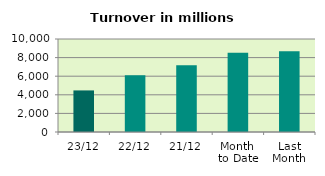
| Category | Series 0 |
|---|---|
| 23/12 | 4471.408 |
| 22/12 | 6099.31 |
| 21/12 | 7180.555 |
| Month 
to Date | 8525.222 |
| Last
Month | 8686.894 |